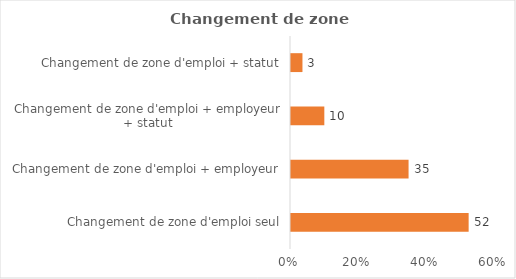
| Category | Series 0 |
|---|---|
| Changement de zone d'emploi seul | 52.248 |
| Changement de zone d'emploi + employeur | 34.578 |
| Changement de zone d'emploi + employeur + statut | 9.802 |
| Changement de zone d'emploi + statut | 3.372 |